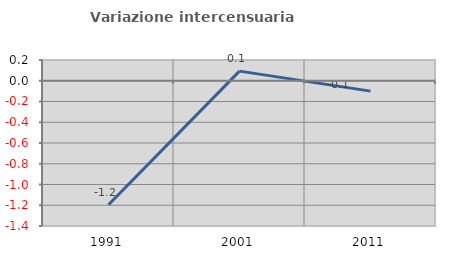
| Category | Variazione intercensuaria annua |
|---|---|
| 1991.0 | -1.195 |
| 2001.0 | 0.093 |
| 2011.0 | -0.1 |